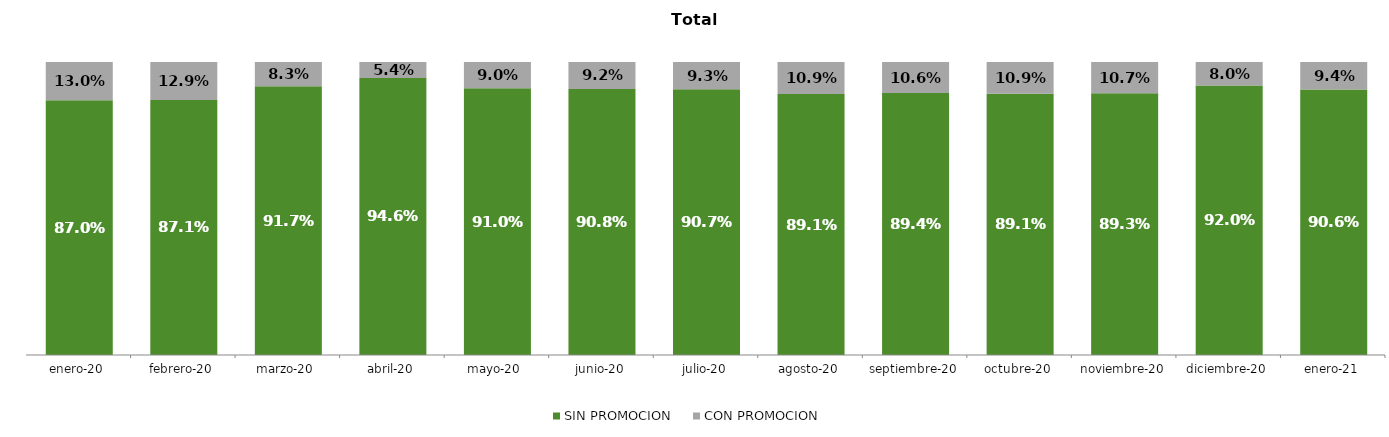
| Category | SIN PROMOCION   | CON PROMOCION   |
|---|---|---|
| 2020-01-01 | 0.87 | 0.13 |
| 2020-02-01 | 0.871 | 0.129 |
| 2020-03-01 | 0.917 | 0.083 |
| 2020-04-01 | 0.946 | 0.054 |
| 2020-05-01 | 0.91 | 0.09 |
| 2020-06-01 | 0.908 | 0.092 |
| 2020-07-01 | 0.907 | 0.093 |
| 2020-08-01 | 0.891 | 0.109 |
| 2020-09-01 | 0.894 | 0.106 |
| 2020-10-01 | 0.891 | 0.109 |
| 2020-11-01 | 0.893 | 0.107 |
| 2020-12-01 | 0.92 | 0.08 |
| 2021-01-01 | 0.906 | 0.094 |